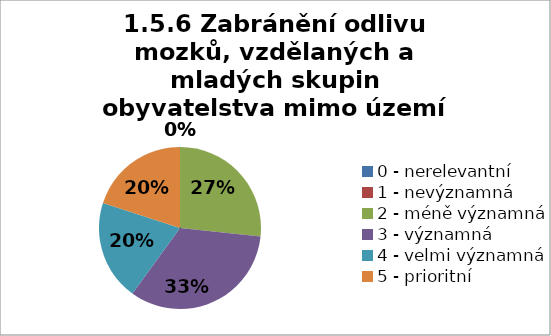
| Category | Series 3 | Series 2 | Series 1 | Series 0 |
|---|---|---|---|---|
| 0 - nerelevantní | 0 | 0 | 0 | 0 |
| 1 - nevýznamná | 0 | 6.667 | 0 | 0 |
| 2 - méně významná | 26.667 | 0 | 6.667 | 0 |
| 3 - významná | 33.333 | 53.333 | 46.667 | 33.333 |
| 4 - velmi významná | 20 | 40 | 33.333 | 40 |
| 5 - prioritní | 20 | 0 | 13.333 | 26.667 |